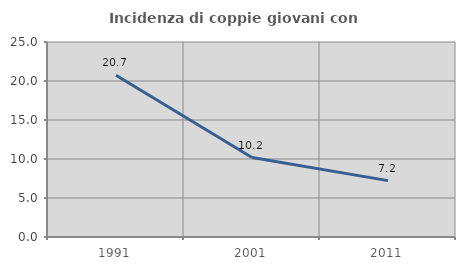
| Category | Incidenza di coppie giovani con figli |
|---|---|
| 1991.0 | 20.738 |
| 2001.0 | 10.187 |
| 2011.0 | 7.229 |